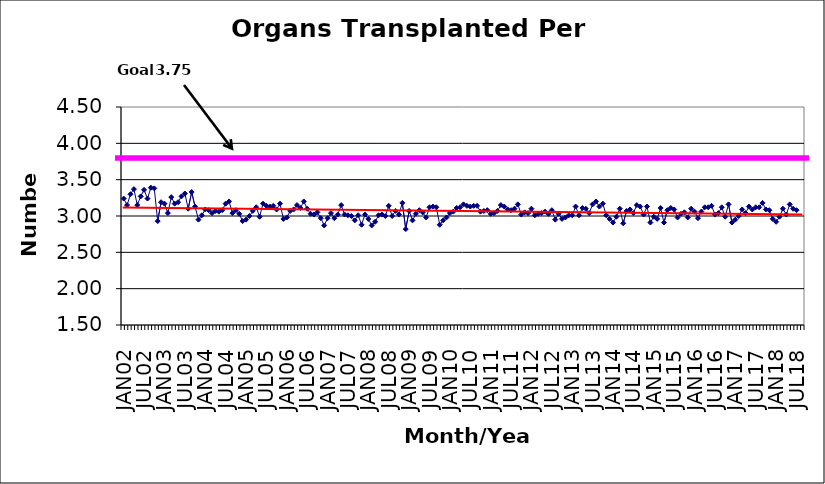
| Category | Series 0 |
|---|---|
| JAN02 | 3.24 |
| FEB02 | 3.15 |
| MAR02 | 3.3 |
| APR02 | 3.37 |
| MAY02 | 3.15 |
| JUN02 | 3.27 |
| JUL02 | 3.36 |
| AUG02 | 3.24 |
| SEP02 | 3.39 |
| OCT02 | 3.38 |
| NOV02 | 2.93 |
| DEC02 | 3.19 |
| JAN03 | 3.17 |
| FEB03 | 3.04 |
| MAR03 | 3.26 |
| APR03 | 3.17 |
| MAY03 | 3.19 |
| JUN03 | 3.27 |
| JUL03 | 3.31 |
| AUG03 | 3.1 |
| SEP03 | 3.33 |
| OCT03 | 3.13 |
| NOV03 | 2.95 |
| DEC03 | 3.01 |
| JAN04 | 3.09 |
| FEB04 | 3.08 |
| MAR04 | 3.04 |
| APR04 | 3.07 |
| MAY04 | 3.06 |
| JUN04 | 3.08 |
| JUL04 | 3.17 |
| AUG04 | 3.2 |
| SEP04 | 3.04 |
| OCT04 | 3.08 |
| NOV04 | 3.03 |
| DEC04 | 2.93 |
| JAN05 | 2.95 |
| FEB05 | 3 |
| MAR05 | 3.07 |
| APR05 | 3.12 |
| MAY05 | 2.99 |
| JUN05 | 3.17 |
| JUL05 | 3.14 |
| AUG05 | 3.13 |
| SEP05 | 3.14 |
| OCT05 | 3.09 |
| NOV05 | 3.17 |
| DEC05 | 2.96 |
| JAN06 | 2.98 |
| FEB06 | 3.07 |
| MAR06 | 3.09 |
| APR06 | 3.15 |
| MAY06 | 3.11 |
| JUN06 | 3.2 |
| JUL06 | 3.1 |
| AUG06 | 3.03 |
| SEP06 | 3.02 |
| OCT06 | 3.05 |
| NOV06 | 2.97 |
| DEC06 | 2.87 |
| JAN07 | 2.97 |
| FEB07 | 3.04 |
| MAR07 | 2.97 |
| APR07 | 3.02 |
| MAY07 | 3.15 |
| JUN07 | 3.02 |
| JUL07 | 3.01 |
| AUG07 | 3 |
| SEP07 | 2.94 |
| OCT07 | 3.01 |
| NOV07 | 2.88 |
| DEC07 | 3.02 |
| JAN08 | 2.96 |
| FEB08 | 2.87 |
| MAR08 | 2.92 |
| APR08 | 3.01 |
| MAY08 | 3.02 |
| JUN08 | 3 |
| JUL08 | 3.14 |
| AUG08 | 3 |
| SEP08 | 3.07 |
| OCT08 | 3.02 |
| NOV08 | 3.18 |
| DEC08 | 2.82 |
| JAN09 | 3.07 |
| FEB09 | 2.94 |
| MAR09 | 3.03 |
| APR09 | 3.08 |
| MAY09 | 3.05 |
| JUN09 | 2.98 |
| JUL09 | 3.12 |
| AUG09 | 3.13 |
| SEP09 | 3.12 |
| OCT09 | 2.88 |
| NOV09 | 2.94 |
| DEC09 | 2.98 |
| JAN10 | 3.04 |
| FEB10 | 3.06 |
| MAR10 | 3.11 |
| APR10 | 3.12 |
| MAY10 | 3.16 |
| JUN10 | 3.14 |
| JUL10 | 3.13 |
| AUG10 | 3.14 |
| SEP10 | 3.14 |
| OCT10 | 3.06 |
| NOV10 | 3.07 |
| DEC10 | 3.08 |
| JAN11 | 3.03 |
| FEB11 | 3.04 |
| MAR11 | 3.07 |
| APR11 | 3.15 |
| MAY11 | 3.13 |
| JUN11 | 3.09 |
| JUL11 | 3.08 |
| AUG11 | 3.1 |
| SEP11 | 3.16 |
| OCT11 | 3.02 |
| NOV11 | 3.05 |
| DEC11 | 3.04 |
| JAN12 | 3.1 |
| FEB12 | 3.01 |
| MAR12 | 3.03 |
| APR12 | 3.04 |
| MAY12 | 3.06 |
| JUN12 | 3.03 |
| JUL12 | 3.08 |
| AUG12 | 2.95 |
| SEP12 | 3.03 |
| OCT12 | 2.96 |
| NOV12 | 2.98 |
| DEC12 | 3.01 |
| JAN13 | 3.01 |
| FEB13 | 3.13 |
| MAR13 | 3.01 |
| APR13 | 3.11 |
| MAY13 | 3.1 |
| JUN13 | 3.04 |
| JUL13 | 3.16 |
| AUG13 | 3.2 |
| SEP13 | 3.13 |
| OCT13 | 3.17 |
| NOV13 | 3.01 |
| DEC13 | 2.96 |
| JAN14 | 2.91 |
| FEB14 | 2.99 |
| MAR14 | 3.1 |
| APR14 | 2.9 |
| MAY14 | 3.07 |
| JUN14 | 3.09 |
| JUL14 | 3.04 |
| AUG14 | 3.15 |
| SEP14 | 3.13 |
| OCT14 | 3.02 |
| NOV14 | 3.13 |
| DEC14 | 2.91 |
| JAN15 | 2.99 |
| FEB15 | 2.96 |
| MAR15 | 3.11 |
| APR15 | 2.91 |
| MAY15 | 3.08 |
| JUN15 | 3.11 |
| JUL15 | 3.09 |
| AUG15 | 2.98 |
| SEP15 | 3.03 |
| OCT15 | 3.05 |
| NOV15 | 2.98 |
| DEC15 | 3.1 |
| JAN16 | 3.06 |
| FEB16 | 2.97 |
| MAR16 | 3.06 |
| APR16 | 3.12 |
| MAY16 | 3.12 |
| JUN16 | 3.14 |
| JUL16 | 3.02 |
| AUG16 | 3.04 |
| SEP16 | 3.12 |
| OCT16 | 2.99 |
| NOV16 | 3.16 |
| DEC16 | 2.91 |
| JAN17 | 2.95 |
| FEB17 | 3 |
| MAR17 | 3.09 |
| APR17 | 3.04 |
| MAY17 | 3.13 |
| JUN17 | 3.09 |
| JUL17 | 3.12 |
| AUG17 | 3.12 |
| SEP17 | 3.18 |
| OCT17 | 3.09 |
| NOV17 | 3.08 |
| DEC17 | 2.96 |
| JAN18 | 2.92 |
| FEB18 | 2.99 |
| MAR18 | 3.1 |
| APR18 | 3.02 |
| MAY18 | 3.16 |
| JUN18 | 3.1 |
| JUL18 | 3.08 |